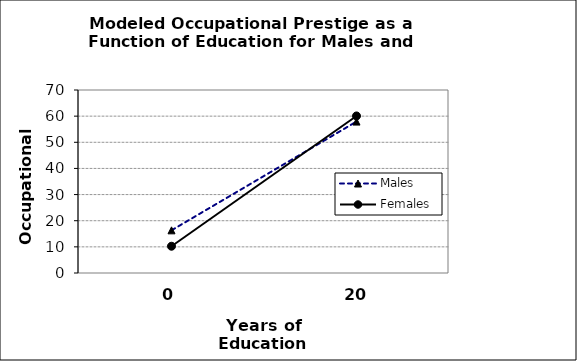
| Category | Males | Females |
|---|---|---|
| 0 | 16.32 | 10.237 |
| 1 | 57.919 | 60.074 |